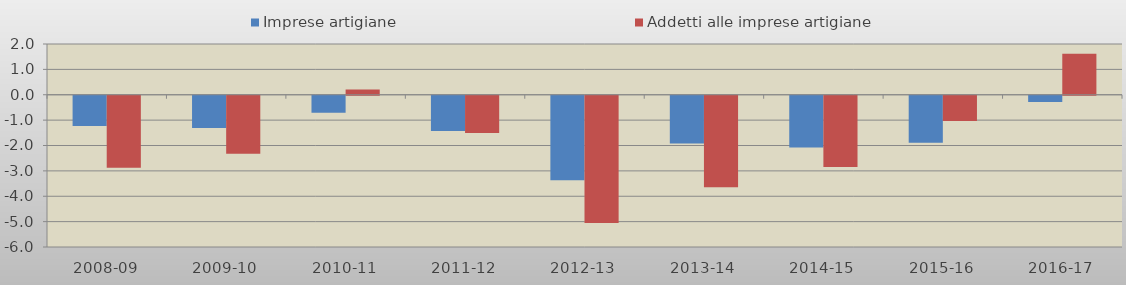
| Category | Imprese artigiane | Addetti alle imprese artigiane |
|---|---|---|
| 2008-09 | -1.192 | -2.839 |
| 2009-10 | -1.274 | -2.289 |
| 2010-11 | -0.667 | 0.208 |
| 2011-12 | -1.385 | -1.468 |
| 2012-13 | -3.333 | -5.014 |
| 2013-14 | -1.887 | -3.604 |
| 2014-15 | -2.043 | -2.812 |
| 2015-16 | -1.85 | -0.991 |
| 2016-17 | -0.249 | 1.615 |